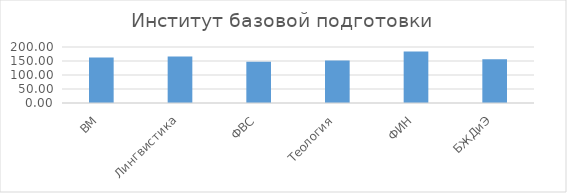
| Category | Series 0 |
|---|---|
| ВМ | 162.5 |
| Лингвистика | 166.111 |
| ФВС | 147.556 |
| Теология | 151.667 |
| ФИН | 184 |
| БЖДиЭ | 156 |